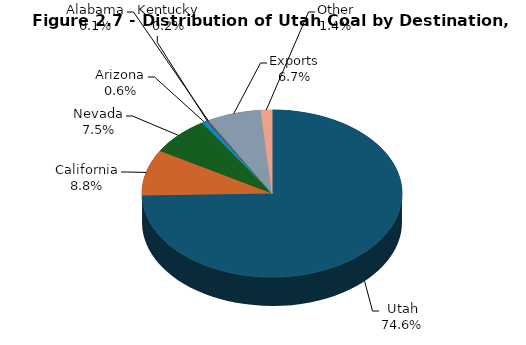
| Category | Series 0 |
|---|---|
| Utah | 12047.41 |
| California | 1427.149 |
| Nevada | 1211.677 |
| Arizona | 100.689 |
| Kentucky | 31.188 |
| Alabama | 13.507 |
| Exports | 1080 |
| Other | 228.183 |